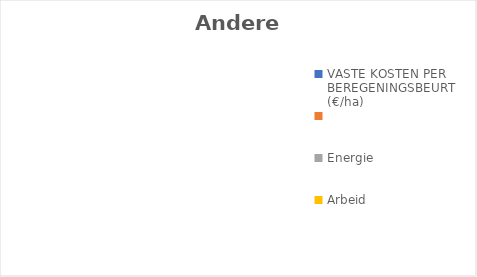
| Category | Andere teelt |
|---|---|
| VASTE KOSTEN PER BEREGENINGSBEURT  (€/ha)  | 0 |
| Energie | 0 |
| Arbeid | 0 |
| Wateraanvoer  | 0 |